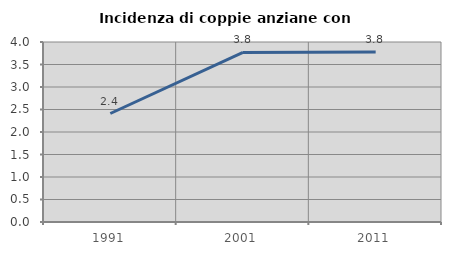
| Category | Incidenza di coppie anziane con figli |
|---|---|
| 1991.0 | 2.411 |
| 2001.0 | 3.769 |
| 2011.0 | 3.776 |